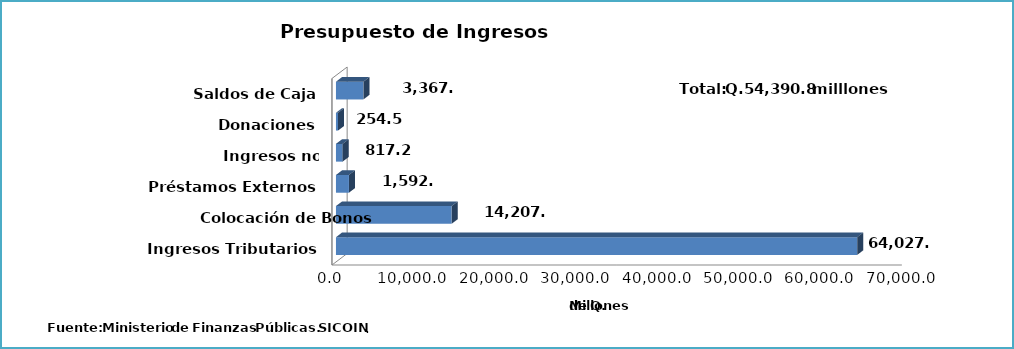
| Category | Series 0 |
|---|---|
| Ingresos Tributarios | 64027.7 |
| Colocación de Bonos | 14207.6 |
| Préstamos Externos | 1592.6 |
| Ingresos no Tributarios | 817.2 |
| Donaciones | 254.5 |
| Saldos de Caja | 3367.4 |